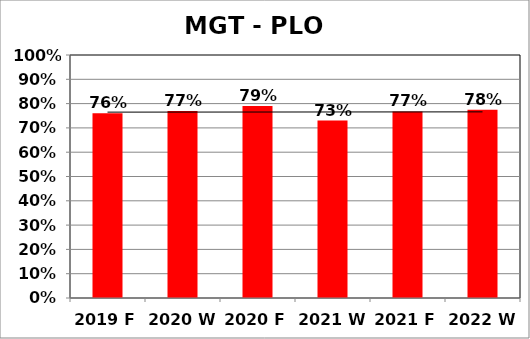
| Category | Series 0 |
|---|---|
| 2019 F | 0.76 |
| 2020 W | 0.77 |
| 2020 F | 0.79 |
| 2021 W | 0.73 |
| 2021 F | 0.768 |
| 2022 W | 0.775 |